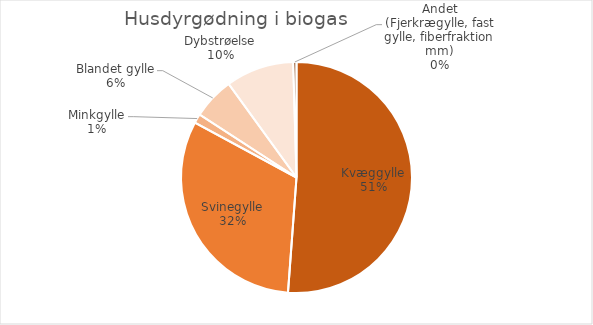
| Category | Series 0 |
|---|---|
| Kvæggylle | 4634041.17 |
| Svinegylle | 2870527.8 |
| Minkgylle | 117342.21 |
| Blandet gylle | 528743.135 |
| Dybstrøelse | 862883.52 |
| Andet (Fjerkrægylle, fast gylle, fiberfraktion mm) | 41733.545 |